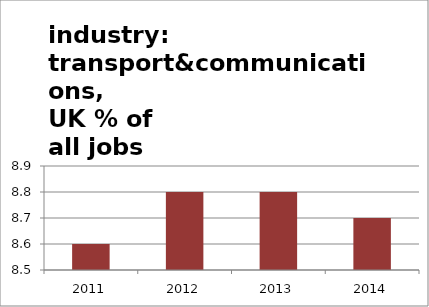
| Category | H,J: Transport & communications |
|---|---|
| 2011.0 | 8.6 |
| 2012.0 | 8.8 |
| 2013.0 | 8.8 |
| 2014.0 | 8.7 |